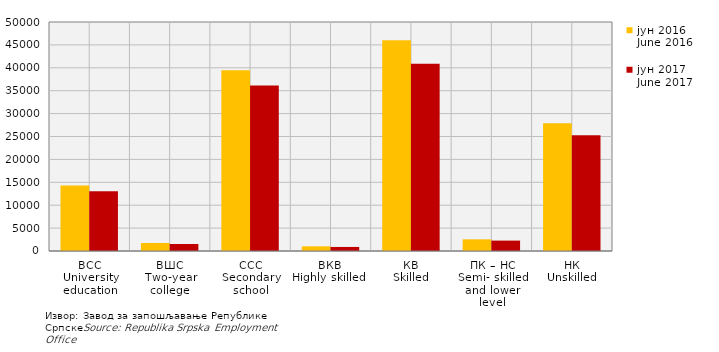
| Category | јун 2016
June 2016 | јун 2017
June 2017 |
|---|---|---|
| ВСС
University education | 14311 | 13056 |
| ВШС
Two-year college | 1752 | 1526 |
| ССС
Secondary school | 39492 | 36152 |
| ВКВ 
Highly skilled    | 1023 | 884 |
| КВ
Skilled | 46016 | 40859 |
| ПК – НС
Semi- skilled and lower level | 2548 | 2271 |
| НК
Unskilled | 27899 | 25288 |